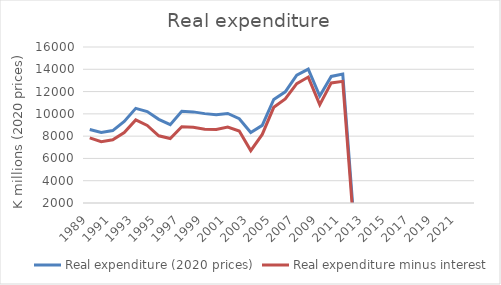
| Category | Real expenditure (2020 prices) | Real expenditure minus interest |
|---|---|---|
| 1989.0 | 8590.606 | 7846.267 |
| 1990.0 | 8338.381 | 7506.916 |
| 1991.0 | 8501.812 | 7667.951 |
| 1992.0 | 9320.473 | 8325.502 |
| 1993.0 | 10492.104 | 9456.686 |
| 1994.0 | 10203.61 | 8960.492 |
| 1995.0 | 9510.273 | 8030.356 |
| 1996.0 | 9032.893 | 7784.851 |
| 1997.0 | 10237.929 | 8848.089 |
| 1998.0 | 10176.587 | 8790.216 |
| 1999.0 | 10020.987 | 8616.196 |
| 2000.0 | 9921.987 | 8595.631 |
| 2001.0 | 10035.75 | 8809.668 |
| 2002.0 | 9559.898 | 8454.573 |
| 2003.0 | 8333.39 | 6700.448 |
| 2004.0 | 8967.782 | 8152.686 |
| 2005.0 | 11294.304 | 10587.654 |
| 2006.0 | 11980.109 | 11343.333 |
| 2007.0 | 13468.23 | 12707.502 |
| 2008.0 | 14009.442 | 13302.459 |
| 2009.0 | 11603.37 | 10823.936 |
| 2010.0 | 13360.322 | 12777.379 |
| 2011.0 | 13576.578 | 12918.52 |
| 2012.0 | 0 | -683.934 |
| 2013.0 | 0 | -755.199 |
| 2014.0 | 0 | -1285.172 |
| 2015.0 | 826.389 | -570.026 |
| 2016.0 | 629.583 | -910.034 |
| 2017.0 | 565.324 | -1322.44 |
| 2018.0 | 754.799 | -1380.157 |
| 2019.0 | 1256.35 | -1013.24 |
| 2020.0 | 1465 | -700.1 |
| 2021.0 | 1292.784 | -820.337 |
| 2022.0 | 1173.176 | -1089.723 |